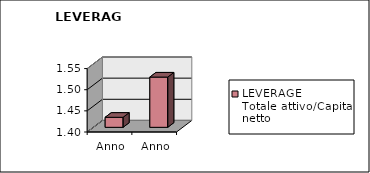
| Category | LEVERAGE
Totale attivo/Capitale netto |
|---|---|
| Anno 2023 | 1.424 |
| Anno 2022 | 1.519 |